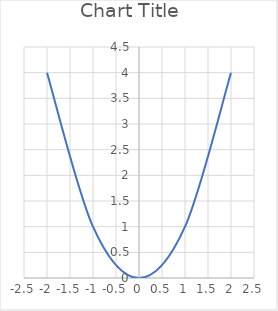
| Category | Series 0 |
|---|---|
| -2.0 | 4 |
| -1.0 | 1 |
| 0.0 | 0 |
| 1.0 | 1 |
| 2.0 | 4 |